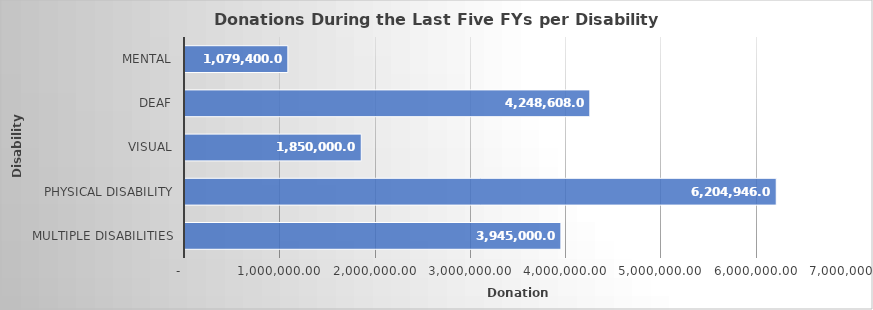
| Category | Total |
|---|---|
| MULTIPLE DISABILITIES | 3945000 |
| PHYSICAL DISABILITY | 6204946 |
| VISUAL | 1850000 |
| DEAF | 4248608 |
| MENTAL | 1079400 |